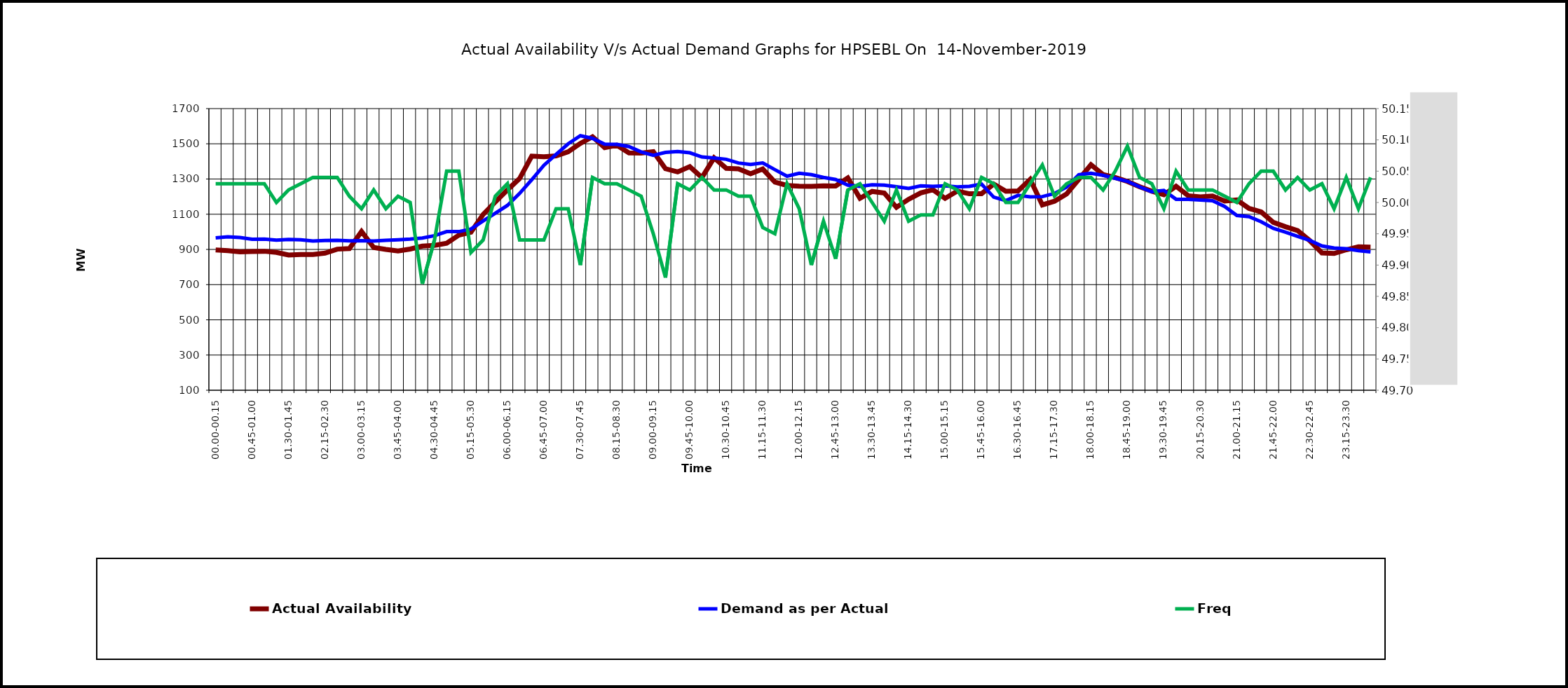
| Category | Actual Availability | Demand as per Actual |
|---|---|---|
| 00.00-00.15 | 897.411 | 966 |
| 00.15-00.30 | 893.078 | 972 |
| 00.30-00.45 | 886.394 | 968 |
| 00.45-01.00 | 888.487 | 958 |
| 01.00-01.15 | 889.493 | 959 |
| 01.15-01.30 | 882.833 | 953 |
| 01.30-01.45 | 868.069 | 957 |
| 01.45-02:00 | 870.721 | 955 |
| 02.00-02.15 | 871.494 | 948 |
| 02.15-02.30 | 879.141 | 951 |
| 02.30-02.45 | 901.503 | 952 |
| 02.45-03:00 | 904.503 | 949 |
| 03.00-03.15 | 1001.801 | 950 |
| 03.15-03.30 | 910.69 | 948 |
| 03.30-03.45 | 899.956 | 952 |
| 03.45-04.00 | 891.296 | 955 |
| 04.00-04.15 | 902.097 | 959 |
| 04.15-04.30 | 918.698 | 965 |
| 04.30-04.45 | 923.22 | 978 |
| 04.45-05.00 | 934.867 | 1001 |
| 05.00-05.15 | 980.842 | 1001 |
| 05.15-05.30 | 998.041 | 1016 |
| 05.30-05.45 | 1098.475 | 1062 |
| 05.45-06.00 | 1169.014 | 1105 |
| 06.00-06.15 | 1237.949 | 1150 |
| 06.15-06.30 | 1302.768 | 1218 |
| 06.30-06.45 | 1430.353 | 1296 |
| 06.45-07.00 | 1426.475 | 1378 |
| 07.00-07.15 | 1431.484 | 1440 |
| 07.15-07.30 | 1454.98 | 1500 |
| 07.30-07.45 | 1502.484 | 1546 |
| 07.45-08.00 | 1539.98 | 1531 |
| 08.00-08.15 | 1478.321 | 1498 |
| 08.15-08.30 | 1492.129 | 1497 |
| 08.30-08.45 | 1448.481 | 1484 |
| 08.45-09.00 | 1446.969 | 1454 |
| 09.00-09.15 | 1455.558 | 1435 |
| 09.15-09.30 | 1358.492 | 1451 |
| 09.30-09.45 | 1340.318 | 1456 |
| 09.45-10.00 | 1370.108 | 1449 |
| 10.00-10.15 | 1308.621 | 1425 |
| 10.15-10.30 | 1420.026 | 1419 |
| 10.30-10.45 | 1360.638 | 1412 |
| 10.45-11.00 | 1357.388 | 1391 |
| 11.00-11.15 | 1329.862 | 1383 |
| 11.15-11.30 | 1356.735 | 1391 |
| 11.30-11.45 | 1282.73 | 1353 |
| 11.45-12.00 | 1263.465 | 1316 |
| 12.00-12.15 | 1259.228 | 1333 |
| 12.15-12.30 | 1258.461 | 1325 |
| 12.30-12.45 | 1261.236 | 1309 |
| 12.45-13.00 | 1260.214 | 1297 |
| 13.00-13.15 | 1306.371 | 1265 |
| 13.15-13.30 | 1190.515 | 1258 |
| 13.30-13.45 | 1229.363 | 1267 |
| 13.45-14.00 | 1219.987 | 1265 |
| 14.00-14.15 | 1139 | 1256 |
| 14.15-14.30 | 1185 | 1246 |
| 14.30-14.45 | 1221 | 1261 |
| 14.45-15.00 | 1239 | 1258 |
| 15.00-15.15 | 1190 | 1261 |
| 15.15-15.30 | 1231 | 1255 |
| 15.30-15.45 | 1216 | 1258 |
| 15.45-16.00 | 1216 | 1271 |
| 16.00-16.15 | 1271 | 1197 |
| 16.15-16.30 | 1230 | 1177 |
| 16.30-16.45 | 1232 | 1207 |
| 16.45-17.00 | 1298 | 1199 |
| 17.00-17.15 | 1153 | 1200 |
| 17.15-17.30 | 1174 | 1218 |
| 17.30-17.45 | 1215 | 1254 |
| 17.45-18.00 | 1298 | 1324 |
| 18.00-18.15 | 1381 | 1333 |
| 18.15-18.30 | 1325 | 1321 |
| 18.30-18.45 | 1308 | 1304 |
| 18.45-19.00 | 1286 | 1287 |
| 19.00-19.15 | 1256 | 1255 |
| 19.15-19.30 | 1231 | 1228 |
| 19.30-19.45 | 1211 | 1235 |
| 19.45-20.00 | 1259 | 1185 |
| 20.00-20.15 | 1205 | 1185 |
| 20.15-20.30 | 1199 | 1181 |
| 20.30-20.45 | 1203 | 1177 |
| 20.45-21.00 | 1175 | 1144 |
| 21.00-21.15 | 1181 | 1093 |
| 21.15-21.30 | 1133 | 1086 |
| 21.30-21.45 | 1113 | 1057 |
| 21.45-22.00 | 1054 | 1020 |
| 22.00-22.15 | 1029 | 998 |
| 22.15-22.30 | 1007 | 974 |
| 22.30-22.45 | 950 | 951 |
| 22.45-23.00 | 880 | 920 |
| 23.00-23.15 | 877 | 908 |
| 23.15-23.30 | 898 | 904 |
| 23.30-23.45 | 915 | 893 |
| 23.45-24.00 | 913 | 886 |